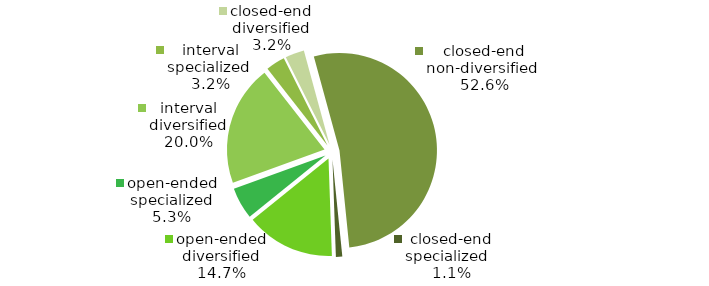
| Category | Series 0 |
|---|---|
| open-ended diversified | 14 |
| open-ended specialized | 5 |
| interval diversified | 19 |
| interval specialized  | 3 |
| closed-end diversified | 3 |
| closed-end non-diversified  | 50 |
| closed-end specialized   | 1 |